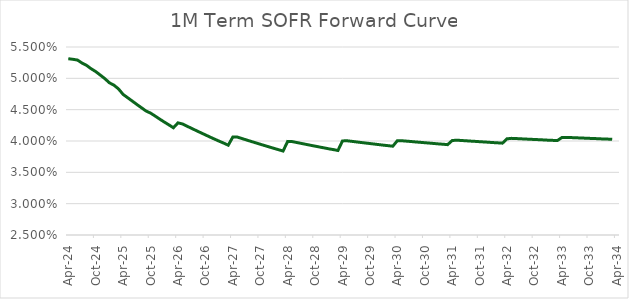
| Category | Series 0 |
|---|---|
| 2024-04-29 | 0.053 |
| 2024-05-30 | 0.053 |
| 2024-06-27 | 0.053 |
| 2024-07-30 | 0.052 |
| 2024-08-29 | 0.052 |
| 2024-09-27 | 0.052 |
| 2024-10-30 | 0.051 |
| 2024-11-27 | 0.051 |
| 2024-12-30 | 0.05 |
| 2025-01-30 | 0.049 |
| 2025-02-27 | 0.049 |
| 2025-03-28 | 0.048 |
| 2025-04-29 | 0.047 |
| 2025-05-29 | 0.047 |
| 2025-06-27 | 0.046 |
| 2025-07-30 | 0.046 |
| 2025-08-28 | 0.045 |
| 2025-09-29 | 0.045 |
| 2025-10-30 | 0.044 |
| 2025-11-26 | 0.044 |
| 2025-12-30 | 0.043 |
| 2026-01-29 | 0.043 |
| 2026-02-26 | 0.043 |
| 2026-03-30 | 0.042 |
| 2026-04-29 | 0.043 |
| 2026-05-28 | 0.043 |
| 2026-06-29 | 0.042 |
| 2026-07-30 | 0.042 |
| 2026-08-28 | 0.042 |
| 2026-09-29 | 0.041 |
| 2026-10-29 | 0.041 |
| 2026-11-27 | 0.041 |
| 2026-12-30 | 0.04 |
| 2027-01-28 | 0.04 |
| 2027-02-25 | 0.04 |
| 2027-03-30 | 0.039 |
| 2027-04-29 | 0.041 |
| 2027-05-27 | 0.041 |
| 2027-06-29 | 0.04 |
| 2027-07-29 | 0.04 |
| 2027-08-30 | 0.04 |
| 2027-09-29 | 0.04 |
| 2027-10-28 | 0.039 |
| 2027-11-29 | 0.039 |
| 2027-12-30 | 0.039 |
| 2028-01-28 | 0.039 |
| 2028-02-28 | 0.039 |
| 2028-03-30 | 0.038 |
| 2028-04-27 | 0.04 |
| 2028-05-30 | 0.04 |
| 2028-06-29 | 0.04 |
| 2028-07-28 | 0.04 |
| 2028-08-30 | 0.039 |
| 2028-09-28 | 0.039 |
| 2028-10-30 | 0.039 |
| 2028-11-29 | 0.039 |
| 2028-12-28 | 0.039 |
| 2029-01-30 | 0.039 |
| 2029-02-27 | 0.039 |
| 2029-03-28 | 0.038 |
| 2029-04-27 | 0.04 |
| 2029-05-30 | 0.04 |
| 2029-06-28 | 0.04 |
| 2029-07-30 | 0.04 |
| 2029-08-30 | 0.04 |
| 2029-09-27 | 0.04 |
| 2029-10-30 | 0.04 |
| 2029-11-29 | 0.04 |
| 2029-12-28 | 0.039 |
| 2030-01-30 | 0.039 |
| 2030-02-27 | 0.039 |
| 2030-03-28 | 0.039 |
| 2030-04-29 | 0.04 |
| 2030-05-30 | 0.04 |
| 2030-06-27 | 0.04 |
| 2030-07-30 | 0.04 |
| 2030-08-29 | 0.04 |
| 2030-09-27 | 0.04 |
| 2030-10-30 | 0.04 |
| 2030-11-27 | 0.04 |
| 2030-12-30 | 0.04 |
| 2031-01-30 | 0.04 |
| 2031-02-27 | 0.039 |
| 2031-03-28 | 0.039 |
| 2031-04-29 | 0.04 |
| 2031-05-29 | 0.04 |
| 2031-06-27 | 0.04 |
| 2031-07-30 | 0.04 |
| 2031-08-28 | 0.04 |
| 2031-09-29 | 0.04 |
| 2031-10-30 | 0.04 |
| 2031-11-26 | 0.04 |
| 2031-12-30 | 0.04 |
| 2032-01-29 | 0.04 |
| 2032-02-26 | 0.04 |
| 2032-03-30 | 0.04 |
| 2032-04-29 | 0.04 |
| 2032-05-27 | 0.04 |
| 2032-06-29 | 0.04 |
| 2032-07-29 | 0.04 |
| 2032-08-30 | 0.04 |
| 2032-09-29 | 0.04 |
| 2032-10-28 | 0.04 |
| 2032-11-29 | 0.04 |
| 2032-12-30 | 0.04 |
| 2033-01-28 | 0.04 |
| 2033-02-25 | 0.04 |
| 2033-03-30 | 0.04 |
| 2033-04-28 | 0.041 |
| 2033-05-27 | 0.041 |
| 2033-06-29 | 0.041 |
| 2033-07-28 | 0.041 |
| 2033-08-30 | 0.04 |
| 2033-09-29 | 0.04 |
| 2033-10-28 | 0.04 |
| 2033-11-29 | 0.04 |
| 2033-12-29 | 0.04 |
| 2034-01-30 | 0.04 |
| 2034-02-27 | 0.04 |
| 2034-03-30 | 0.04 |